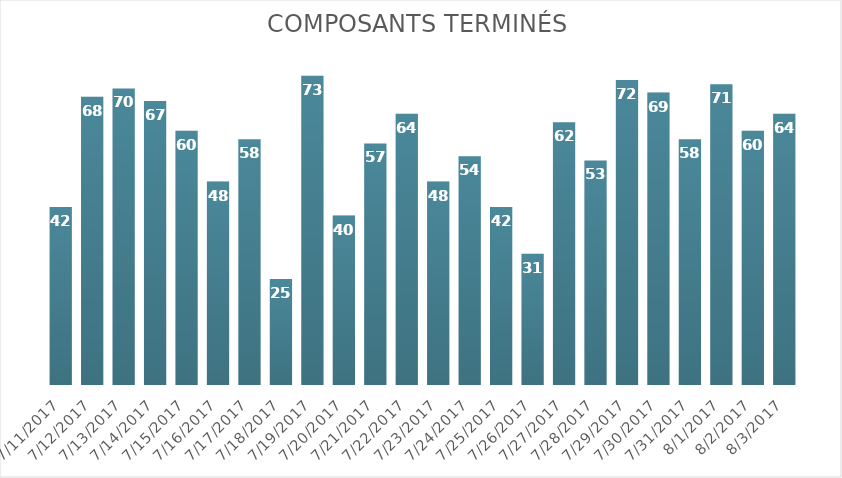
| Category | Composants terminés |
|---|---|
| 7/11/17 | 42 |
| 7/12/17 | 68 |
| 7/13/17 | 70 |
| 7/14/17 | 67 |
| 7/15/17 | 60 |
| 7/16/17 | 48 |
| 7/17/17 | 58 |
| 7/18/17 | 25 |
| 7/19/17 | 73 |
| 7/20/17 | 40 |
| 7/21/17 | 57 |
| 7/22/17 | 64 |
| 7/23/17 | 48 |
| 7/24/17 | 54 |
| 7/25/17 | 42 |
| 7/26/17 | 31 |
| 7/27/17 | 62 |
| 7/28/17 | 53 |
| 7/29/17 | 72 |
| 7/30/17 | 69 |
| 7/31/17 | 58 |
| 8/1/17 | 71 |
| 8/2/17 | 60 |
| 8/3/17 | 64 |